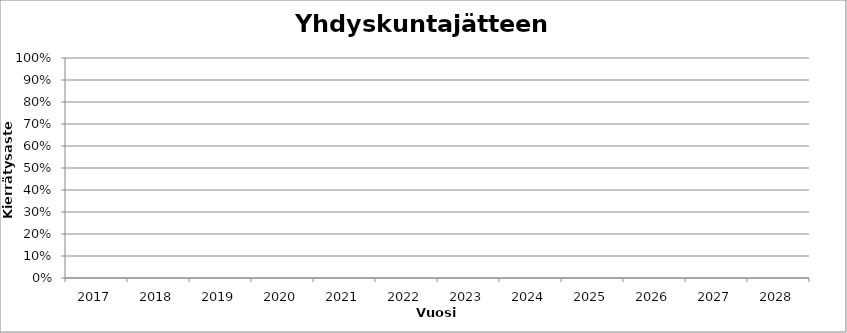
| Category | Series 0 |
|---|---|
| 2017.0 | 0 |
| 2018.0 | 0 |
| 2019.0 | 0 |
| 2020.0 | 0 |
| 2021.0 | 0 |
| 2022.0 | 0 |
| 2023.0 | 0 |
| 2024.0 | 0 |
| 2025.0 | 0 |
| 2026.0 | 0 |
| 2027.0 | 0 |
| 2028.0 | 0 |